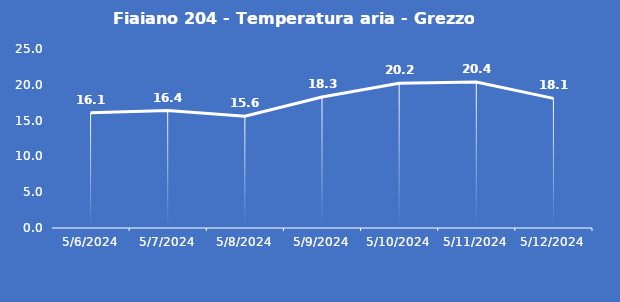
| Category | Fiaiano 204 - Temperatura aria - Grezzo (°C) |
|---|---|
| 5/6/24 | 16.1 |
| 5/7/24 | 16.4 |
| 5/8/24 | 15.6 |
| 5/9/24 | 18.3 |
| 5/10/24 | 20.2 |
| 5/11/24 | 20.4 |
| 5/12/24 | 18.1 |